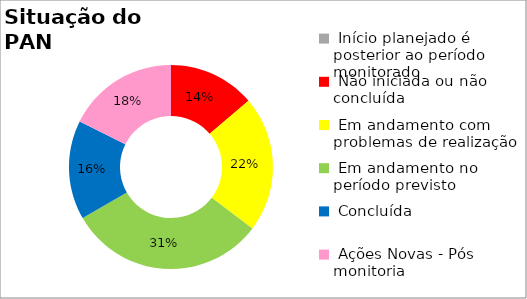
| Category | Series 0 |
|---|---|
|  Início planejado é posterior ao período monitorado | 0 |
|  Não iniciada ou não concluída | 0.137 |
|  Em andamento com problemas de realização | 0.216 |
|  Em andamento no período previsto  | 0.314 |
|  Concluída | 0.157 |
|  Ações Novas - Pós monitoria | 0.176 |